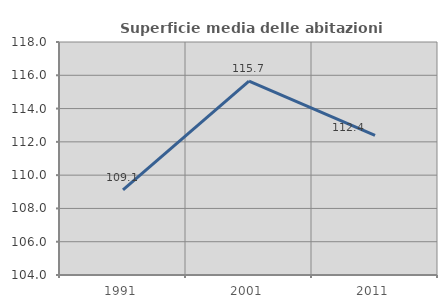
| Category | Superficie media delle abitazioni occupate |
|---|---|
| 1991.0 | 109.121 |
| 2001.0 | 115.65 |
| 2011.0 | 112.387 |